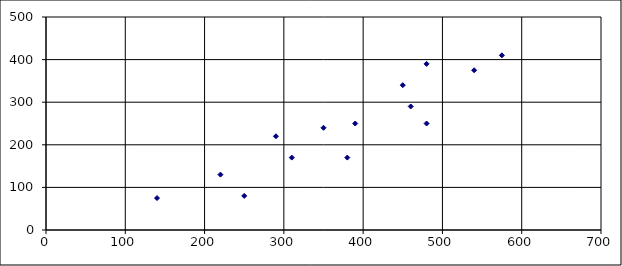
| Category | A |
|---|---|
| 140.0 | 75 |
| 250.0 | 80 |
| 220.0 | 130 |
| 310.0 | 170 |
| 380.0 | 170 |
| 460.0 | 290 |
| 540.0 | 375 |
| 350.0 | 240 |
| 575.0 | 410 |
| 290.0 | 220 |
| 480.0 | 250 |
| 480.0 | 390 |
| 390.0 | 250 |
| 450.0 | 340 |